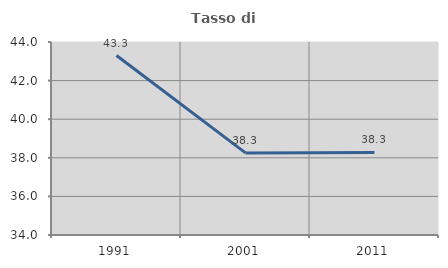
| Category | Tasso di occupazione   |
|---|---|
| 1991.0 | 43.297 |
| 2001.0 | 38.253 |
| 2011.0 | 38.279 |